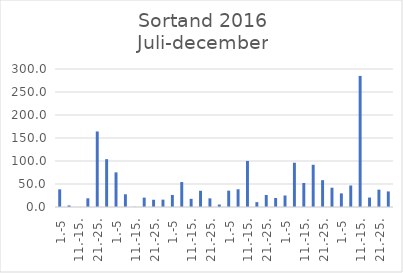
| Category | Series 0 |
|---|---|
| 1.-5 | 38.402 |
| 6.-10. | 3.353 |
| 11.-15. | 0 |
| 16.-20. | 18.893 |
| 21.-25. | 164.209 |
| 26.-31. | 103.978 |
| 1.-5 | 75.262 |
| 6.-10. | 27.611 |
| 11.-15. | 0.456 |
| 16.-20. | 20.398 |
| 21.-25. | 15.774 |
| 26.-31. | 15.975 |
| 1.-5 | 26.175 |
| 6.-10. | 54.252 |
| 11.-15. | 17.738 |
| 16.-20. | 35.294 |
| 21.-25. | 18.775 |
| 26.-30. | 5.333 |
| 1.-5 | 35.528 |
| 6.-10. | 38.527 |
| 11.-15. | 100.137 |
| 16.-20. | 10.573 |
| 21.-25. | 26.149 |
| 26.-31. | 19.603 |
| 1.-5 | 25.052 |
| 6.-10. | 96.186 |
| 11.-15. | 52.143 |
| 16.-20. | 91.796 |
| 21.-25. | 58.353 |
| 26.-30. | 41.947 |
| 1.-5 | 29.64 |
| 6.-10. | 46.722 |
| 11.-15. | 284.949 |
| 16.-20. | 20.5 |
| 21.-25. | 37.683 |
| 26.-31. | 33.862 |